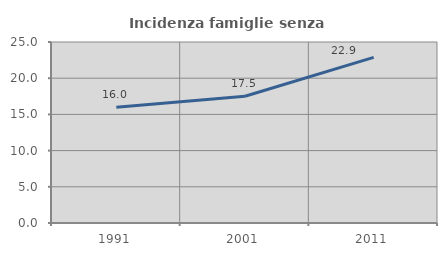
| Category | Incidenza famiglie senza nuclei |
|---|---|
| 1991.0 | 15.975 |
| 2001.0 | 17.511 |
| 2011.0 | 22.875 |